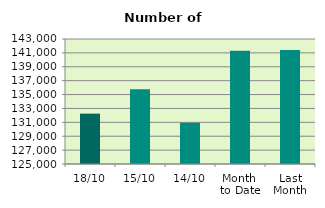
| Category | Series 0 |
|---|---|
| 18/10 | 132252 |
| 15/10 | 135748 |
| 14/10 | 130942 |
| Month 
to Date | 141318.833 |
| Last
Month | 141428.727 |